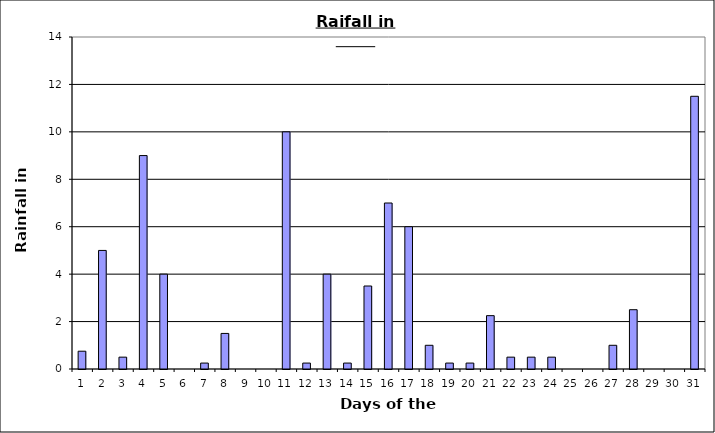
| Category | Series 0 |
|---|---|
| 0 | 0.75 |
| 1 | 5 |
| 2 | 0.5 |
| 3 | 9 |
| 4 | 4 |
| 5 | 0 |
| 6 | 0.25 |
| 7 | 1.5 |
| 8 | 0 |
| 9 | 0 |
| 10 | 10 |
| 11 | 0.25 |
| 12 | 4 |
| 13 | 0.25 |
| 14 | 3.5 |
| 15 | 7 |
| 16 | 6 |
| 17 | 1 |
| 18 | 0.25 |
| 19 | 0.25 |
| 20 | 2.25 |
| 21 | 0.5 |
| 22 | 0.5 |
| 23 | 0.5 |
| 24 | 0 |
| 25 | 0 |
| 26 | 1 |
| 27 | 2.5 |
| 28 | 0 |
| 29 | 0 |
| 30 | 11.5 |